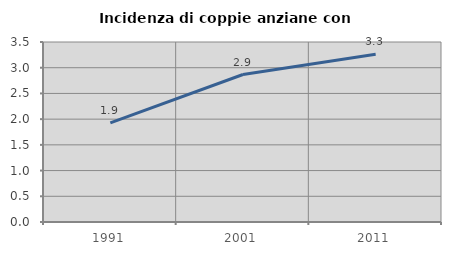
| Category | Incidenza di coppie anziane con figli |
|---|---|
| 1991.0 | 1.929 |
| 2001.0 | 2.868 |
| 2011.0 | 3.262 |